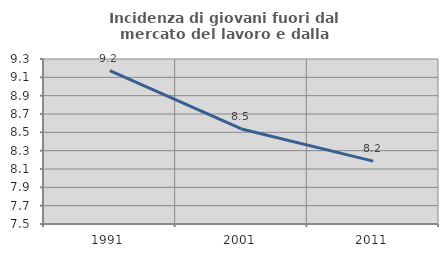
| Category | Incidenza di giovani fuori dal mercato del lavoro e dalla formazione  |
|---|---|
| 1991.0 | 9.172 |
| 2001.0 | 8.537 |
| 2011.0 | 8.186 |